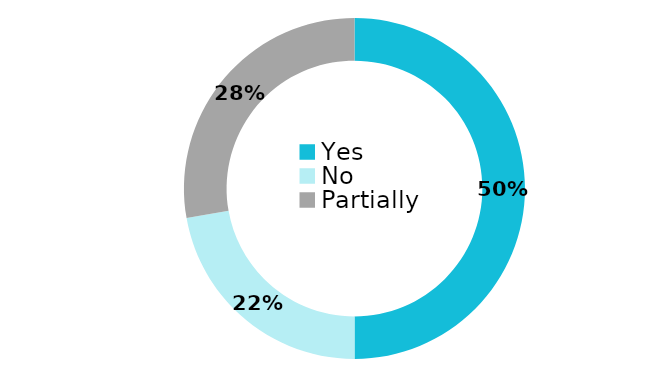
| Category | Series 0 |
|---|---|
| Yes | 27 |
| No | 12 |
| Partially | 15 |